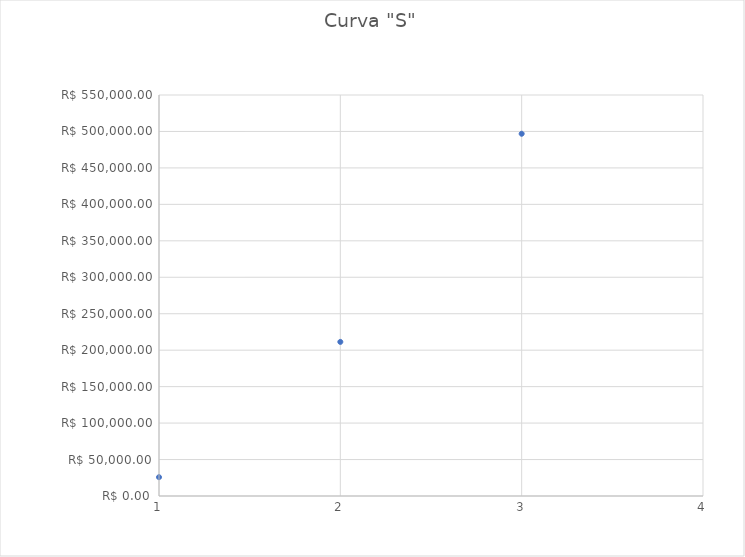
| Category | Series 0 |
|---|---|
| 1.0 | 25828.544 |
| 2.0 | 211370.727 |
| 3.0 | 496847.967 |
| 4.0 | 555105.55 |